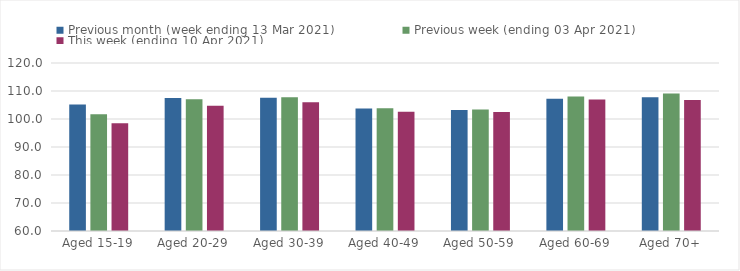
| Category | Previous month (week ending 13 Mar 2021) | Previous week (ending 03 Apr 2021) | This week (ending 10 Apr 2021) |
|---|---|---|---|
| Aged 15-19 | 105.15 | 101.66 | 98.49 |
| Aged 20-29 | 107.49 | 107.09 | 104.7 |
| Aged 30-39 | 107.55 | 107.81 | 105.99 |
| Aged 40-49 | 103.75 | 103.83 | 102.63 |
| Aged 50-59 | 103.25 | 103.42 | 102.48 |
| Aged 60-69 | 107.24 | 108.01 | 106.93 |
| Aged 70+ | 107.8 | 109.11 | 106.76 |